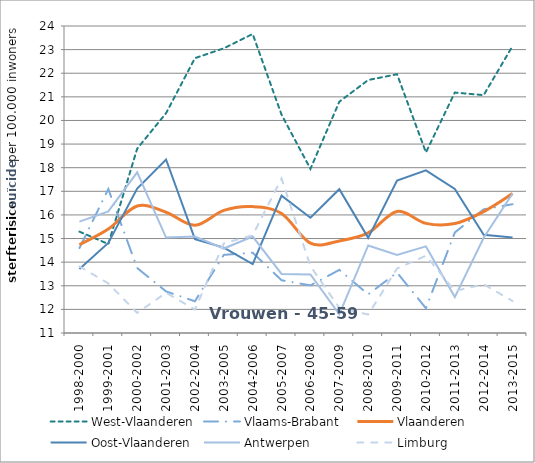
| Category | West-Vlaanderen | Vlaams-Brabant | Vlaanderen | Oost-Vlaanderen | Antwerpen | Limburg |
|---|---|---|---|---|---|---|
| 1998-2000 | 15.292 | 14.595 | 14.736 | 13.715 | 15.718 | 13.818 |
| 1999-2001 | 14.767 | 17.096 | 15.403 | 14.815 | 16.149 | 13.099 |
| 2000-2002 | 18.807 | 13.751 | 16.376 | 17.117 | 17.803 | 11.853 |
| 2001-2003 | 20.307 | 12.76 | 16.114 | 18.347 | 15.041 | 12.702 |
| 2002-2004 | 22.638 | 12.343 | 15.563 | 14.975 | 15.087 | 11.994 |
| 2003-2005 | 23.056 | 14.308 | 16.194 | 14.615 | 14.576 | 14.797 |
| 2004-2006 | 23.662 | 14.402 | 16.352 | 13.914 | 15.085 | 15.138 |
| 2005-2007 | 20.242 | 13.233 | 16.058 | 16.817 | 13.5 | 17.54 |
| 2006-2008 | 17.95 | 13.016 | 14.802 | 15.88 | 13.482 | 13.83 |
| 2007-2009 | 20.793 | 13.673 | 14.898 | 17.09 | 11.791 | 12.065 |
| 2008-2010 | 21.712 | 12.636 | 15.238 | 15.03 | 14.707 | 11.782 |
| 2009-2011 | 21.956 | 13.557 | 16.149 | 17.459 | 14.301 | 13.732 |
| 2010-2012 | 18.648 | 12.047 | 15.643 | 17.888 | 14.668 | 14.271 |
| 2011-2013 | 21.182 | 15.255 | 15.637 | 17.097 | 12.52 | 12.779 |
| 2012-2014 | 21.072 | 16.236 | 16.141 | 15.159 | 15.034 | 13.062 |
| 2013-2015 | 23.152 | 16.454 | 16.902 | 15.047 | 16.907 | 12.358 |